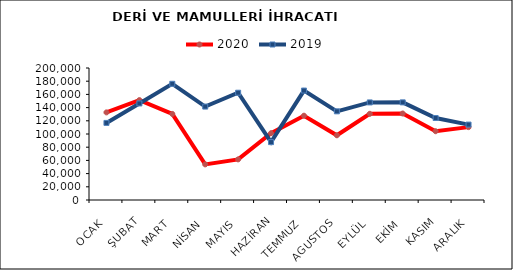
| Category | 2020 | 2019 |
|---|---|---|
| OCAK | 132742.625 | 116808.145 |
| ŞUBAT | 151371.181 | 146285.89 |
| MART | 130407.529 | 176087.67 |
| NİSAN | 53970.504 | 141544.933 |
| MAYIS | 61556.373 | 162533.521 |
| HAZİRAN | 101197.357 | 87699.117 |
| TEMMUZ | 127743.187 | 165806.616 |
| AGUSTOS | 98051.167 | 134348.906 |
| EYLÜL | 130586.237 | 147838.628 |
| EKİM | 131031.153 | 147931.797 |
| KASIM | 104196.278 | 124237.492 |
| ARALIK | 110420.455 | 114255.664 |